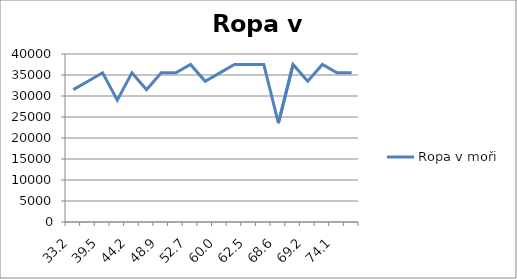
| Category | Ropa v moři |
|---|---|
| 33.2 | 31509 |
| 37.96666666666667 | 33512 |
| 39.45 | 35519 |
| 40.06666666666667 | 29016 |
| 44.166666666666664 | 35508 |
| 47.766666666666666 | 31511 |
| 48.85 | 35516 |
| 49.083333333333336 | 35516 |
| 52.71666666666667 | 37514 |
| 55.38333333333333 | 33511 |
| 59.96666666666667 | 35517 |
| 61.266666666666666 | 37526 |
| 62.483333333333334 | 37516 |
| 68.28333333333333 | 37525 |
| 68.6 | 23516 |
| 68.71666666666667 | 37522 |
| 69.16666666666667 | 33511 |
| 69.7 | 37519 |
| 74.11666666666666 | 35528 |
| 82.86666666666666 | 35525 |